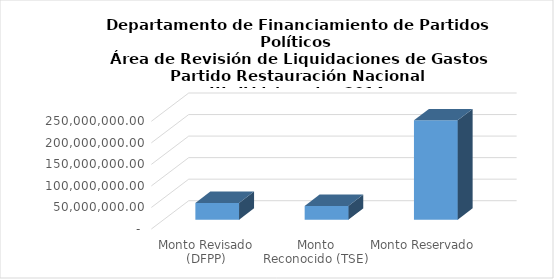
| Category | Series 0 |
|---|---|
| Monto Revisado (DFPP) | 38951184.77 |
| Monto Reconocido (TSE) | 31907464.11 |
| Monto Reservado  | 230843111.686 |